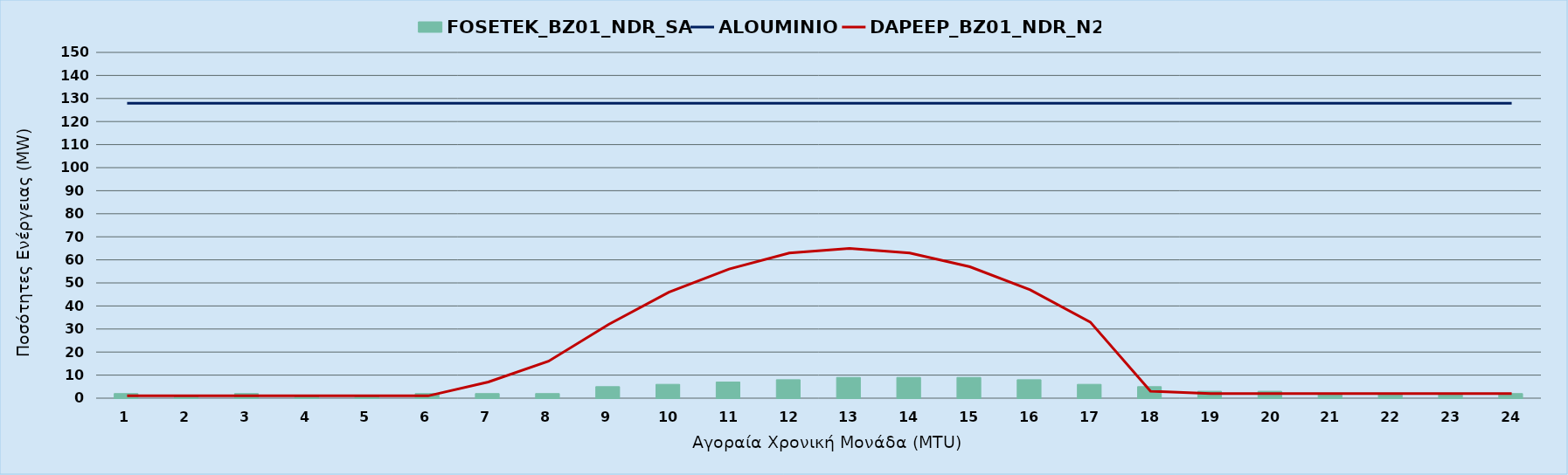
| Category | FOSETEK_BZ01_NDR_SA |
|---|---|
| 0 | 2 |
| 1 | 1 |
| 2 | 2 |
| 3 | 1 |
| 4 | 1 |
| 5 | 2 |
| 6 | 2 |
| 7 | 2 |
| 8 | 5 |
| 9 | 6 |
| 10 | 7 |
| 11 | 8 |
| 12 | 9 |
| 13 | 9 |
| 14 | 9 |
| 15 | 8 |
| 16 | 6 |
| 17 | 5 |
| 18 | 3 |
| 19 | 3 |
| 20 | 2 |
| 21 | 2 |
| 22 | 2 |
| 23 | 2 |